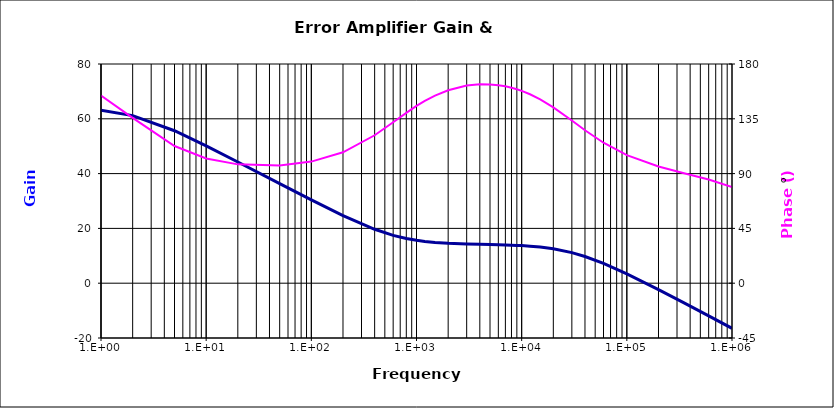
| Category | Error Amplifier Gain |
|---|---|
| 1.0 | 63.15 |
| 2.0 | 61.165 |
| 5.0 | 55.641 |
| 10.0 | 50.115 |
| 20.0 | 44.23 |
| 50.0 | 36.331 |
| 100.0 | 30.394 |
| 200.0 | 24.674 |
| 400.0 | 19.677 |
| 600.0 | 17.458 |
| 800.0 | 16.303 |
| 1000.0 | 15.642 |
| 1200.0 | 15.235 |
| 1500.0 | 14.869 |
| 2000.0 | 14.557 |
| 3000.0 | 14.303 |
| 4000.0 | 14.186 |
| 5000.0 | 14.105 |
| 6000.0 | 14.033 |
| 7000.0 | 13.96 |
| 8000.0 | 13.885 |
| 9000.0 | 13.804 |
| 10000.0 | 13.717 |
| 12000.0 | 13.527 |
| 15000.0 | 13.202 |
| 20000.0 | 12.577 |
| 30000.0 | 11.172 |
| 40000.0 | 9.753 |
| 60000.0 | 7.209 |
| 100000.0 | 3.372 |
| 200000.0 | -2.374 |
| 350000.0 | -7.187 |
| 600000.0 | -11.9 |
| 1000000.0 | -16.466 |